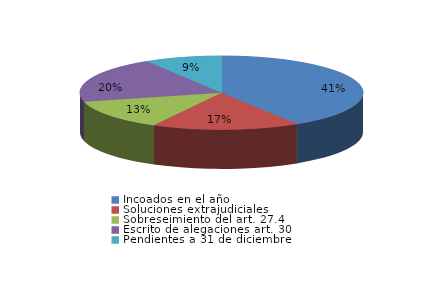
| Category | Series 0 |
|---|---|
| Incoados en el año | 365 |
| Soluciones extrajudiciales | 149 |
| Sobreseimiento del art. 27.4 | 117 |
| Escrito de alegaciones art. 30 | 179 |
| Pendientes a 31 de diciembre | 78 |